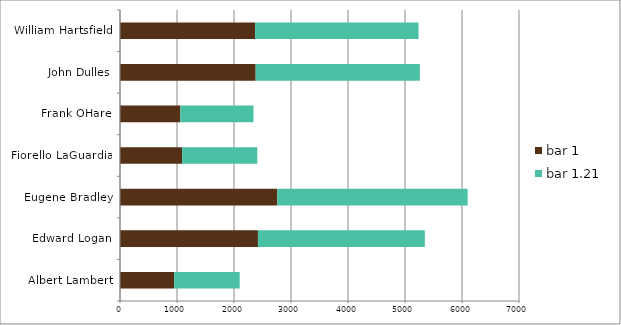
| Category | bar 1 | bar 1.21 |
|---|---|---|
| Albert Lambert | 950 | 1149.5 |
| Edward Logan | 2420 | 2928.2 |
| Eugene Bradley | 2760 | 3339.6 |
| Fiorello LaGuardia | 1090 | 1318.9 |
| Frank OHare | 1060 | 1282.6 |
| John Dulles | 2380 | 2879.8 |
| William Hartsfield | 2370 | 2867.7 |